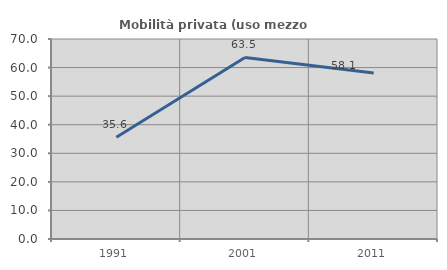
| Category | Mobilità privata (uso mezzo privato) |
|---|---|
| 1991.0 | 35.628 |
| 2001.0 | 63.542 |
| 2011.0 | 58.125 |